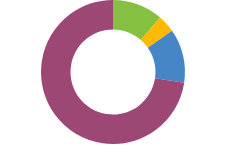
| Category | ESZKÖZÖK |
|---|---|
| KÉSZPÉNZ | 4330000 |
| BEFEKTETÉSEK | 1500000 |
| NYUGDÍJ | 4600000 |
| SZEMÉLYES | 27650000 |